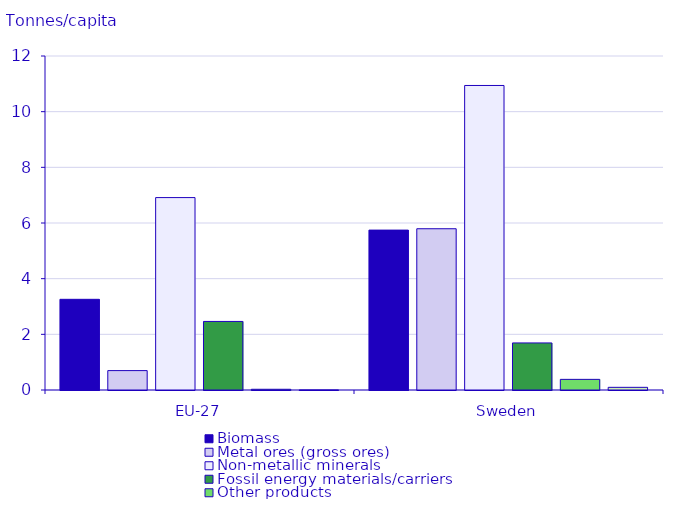
| Category | Biomass | Metal ores (gross ores) | Non-metallic minerals | Fossil energy materials/carriers | Other products | Waste for final treatment and disposal |
|---|---|---|---|---|---|---|
| EU-27 | 3.258 | 0.697 | 6.913 | 2.463 | 0.026 | 0.002 |
| Sweden | 5.745 | 5.793 | 10.941 | 1.691 | 0.382 | 0.096 |